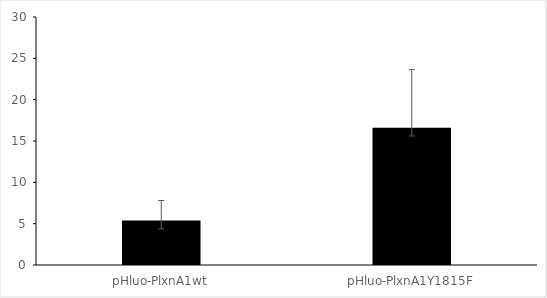
| Category | Series 0 |
|---|---|
| pHluo-PlxnA1wt | 5.371 |
| pHluo-PlxnA1Y1815F | 16.607 |